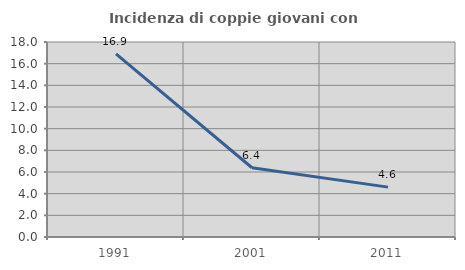
| Category | Incidenza di coppie giovani con figli |
|---|---|
| 1991.0 | 16.901 |
| 2001.0 | 6.393 |
| 2011.0 | 4.603 |